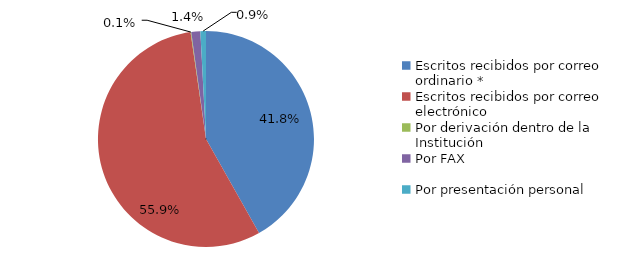
| Category | Series 0 |
|---|---|
| Escritos recibidos por correo ordinario * | 402 |
| Escritos recibidos por correo electrónico | 537 |
| Por derivación dentro de la Institución | 1 |
| Por FAX | 13 |
| Por presentación personal | 8 |